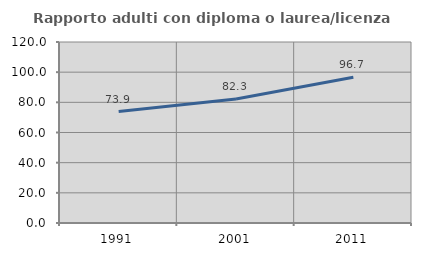
| Category | Rapporto adulti con diploma o laurea/licenza media  |
|---|---|
| 1991.0 | 73.913 |
| 2001.0 | 82.255 |
| 2011.0 | 96.661 |